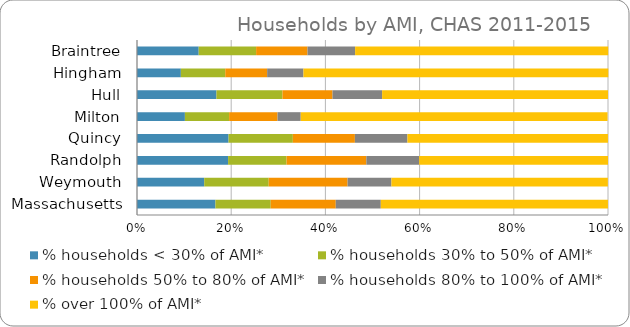
| Category | % households < 30% of AMI* | % households 30% to 50% of AMI* | % households 50% to 80% of AMI* | % households 80% to 100% of AMI* | % over 100% of AMI* |
|---|---|---|---|---|---|
| Braintree | 13.1 | 12.19 | 10.91 | 10.11 | 53.74 |
| Hingham | 9.31 | 9.43 | 8.89 | 7.71 | 64.73 |
| Hull | 16.87 | 14.01 | 10.63 | 10.53 | 47.96 |
| Milton | 10.17 | 9.39 | 10.28 | 4.92 | 65.14 |
| Quincy | 19.44 | 13.65 | 13.17 | 11.16 | 42.57 |
| Randolph | 19.34 | 12.41 | 16.94 | 11.21 | 40.1 |
| Weymouth | 14.27 | 13.69 | 16.75 | 9.31 | 45.95 |
| Massachusetts | 16.65 | 11.74 | 13.81 | 9.56 | 48.23 |